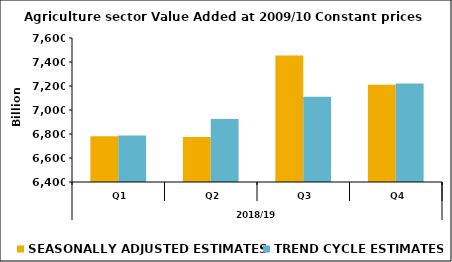
| Category | SEASONALLY ADJUSTED ESTIMATES | TREND CYCLE ESTIMATES |
|---|---|---|
| 0 | 6780.625 | 6787.164 |
| 1 | 6774.786 | 6924.038 |
| 2 | 7453.397 | 7111.365 |
| 3 | 7211.054 | 7220.463 |